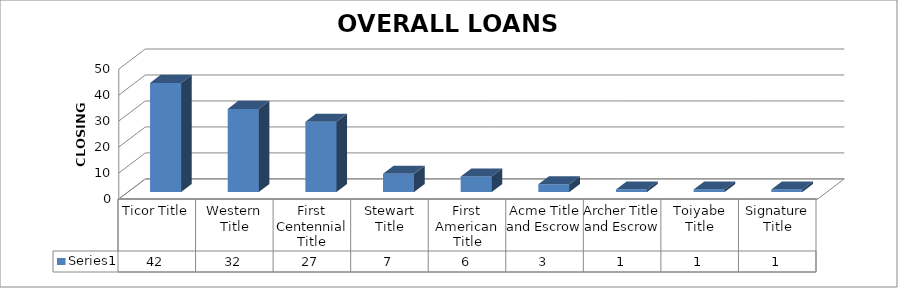
| Category | Series 0 |
|---|---|
| Ticor Title | 42 |
| Western Title | 32 |
| First Centennial Title | 27 |
| Stewart Title | 7 |
| First American Title | 6 |
| Acme Title and Escrow | 3 |
| Archer Title and Escrow | 1 |
| Toiyabe Title | 1 |
| Signature Title | 1 |